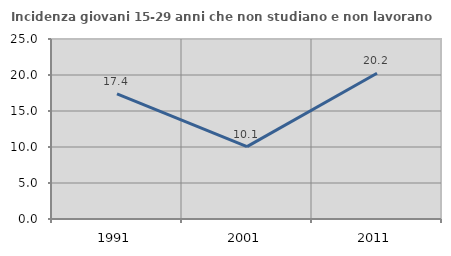
| Category | Incidenza giovani 15-29 anni che non studiano e non lavorano  |
|---|---|
| 1991.0 | 17.391 |
| 2001.0 | 10.056 |
| 2011.0 | 20.235 |